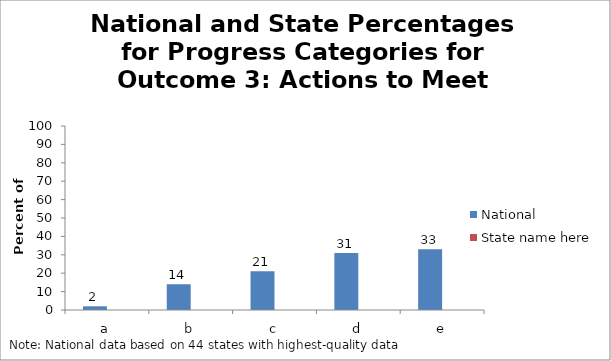
| Category | National | State name here |
|---|---|---|
| a | 2 |  |
| b | 14 |  |
| c | 21 |  |
| d | 31 |  |
| e | 33 |  |